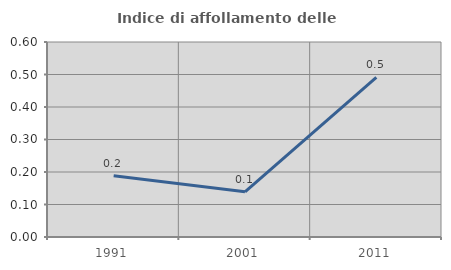
| Category | Indice di affollamento delle abitazioni  |
|---|---|
| 1991.0 | 0.189 |
| 2001.0 | 0.139 |
| 2011.0 | 0.491 |